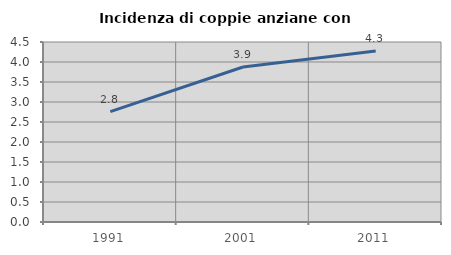
| Category | Incidenza di coppie anziane con figli |
|---|---|
| 1991.0 | 2.76 |
| 2001.0 | 3.876 |
| 2011.0 | 4.276 |